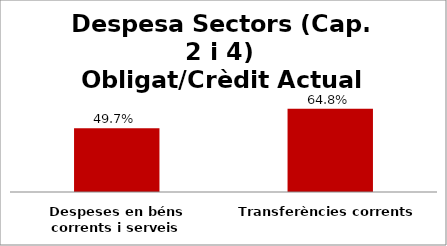
| Category | Series 0 |
|---|---|
| Despeses en béns corrents i serveis | 0.497 |
| Transferències corrents | 0.648 |